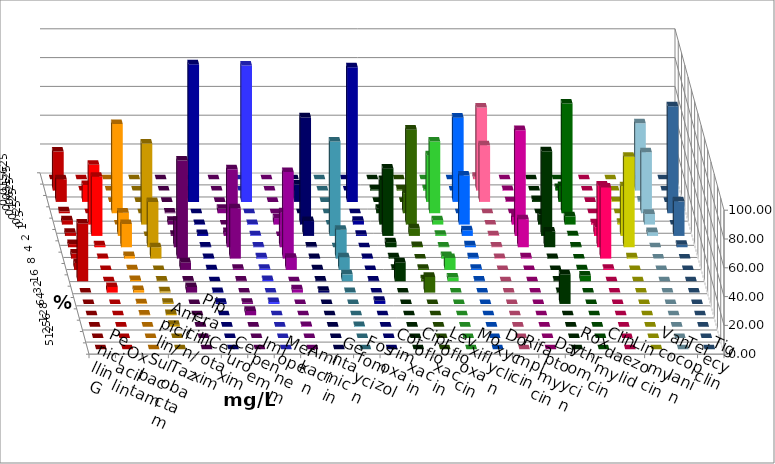
| Category | Penicillin G | Oxacillin | Ampicillin/ Sulbactam | Piperacillin/ Tazobactam | Cefotaxim | Cefuroxim | Imipenem | Meropenem | Amikacin | Gentamicin | Fosfomycin | Cotrimoxazol | Ciprofloxacin | Levofloxacin | Moxifloxacin | Doxycyclin | Rifampicin | Daptomycin | Roxythromycin | Clindamycin | Linezolid | Vancomycin | Teicoplanin | Tigecyclin |
|---|---|---|---|---|---|---|---|---|---|---|---|---|---|---|---|---|---|---|---|---|---|---|---|---|
| 0.015625 | 0 | 0 | 0 | 0 | 0 | 0 | 0 | 0 | 0 | 0 | 0 | 0 | 0 | 0 | 0 | 0 | 1.747 | 0 | 0 | 0 | 0 | 0 | 0 | 0 |
| 0.03125 | 27.074 | 0 | 0 | 0 | 0 | 0 | 0 | 0 | 0 | 0 | 0 | 0 | 0.873 | 0.873 | 0.873 | 0 | 57.642 | 0.442 | 0 | 1.762 | 0 | 0 | 0 | 46.725 |
| 0.0625 | 15.721 | 11.79 | 0 | 0 | 0 | 0 | 95.633 | 94.76 | 0 | 12.108 | 0 | 93.45 | 0 | 0 | 32.314 | 58.515 | 39.301 | 0.442 | 1.316 | 11.013 | 0 | 0.437 | 0 | 0.873 |
| 0.125 | 1.31 | 0 | 62.009 | 0 | 0.437 | 3.057 | 0 | 0 | 0 | 0 | 0 | 0 | 3.057 | 13.974 | 49.782 | 0 | 0 | 0 | 0 | 76.211 | 0 | 0 | 74.236 | 42.358 |
| 0.25 | 3.057 | 41.485 | 0 | 56.332 | 2.62 | 0 | 0.437 | 0.437 | 4.484 | 74.439 | 0 | 2.62 | 31.004 | 65.939 | 3.057 | 34.061 | 0 | 5.31 | 7.018 | 5.727 | 0.873 | 1.31 | 0 | 7.424 |
| 0.5 | 2.183 | 41.048 | 16.157 | 0 | 0.873 | 2.62 | 1.31 | 0.437 | 0 | 10.314 | 65.502 | 0.873 | 46.725 | 5.24 | 0.873 | 3.93 | 0.437 | 73.451 | 58.772 | 0.441 | 6.114 | 34.498 | 24.017 | 2.62 |
| 1.0 | 2.183 | 1.31 | 16.157 | 31.441 | 18.341 | 54.148 | 0.437 | 0.437 | 24.215 | 0.448 | 0 | 0 | 3.493 | 0.873 | 0.437 | 1.31 | 0.437 | 19.469 | 10.965 | 0.441 | 42.795 | 62.882 | 1.747 | 0 |
| 2.0 | 3.493 | 0.437 | 1.747 | 7.86 | 68.122 | 34.934 | 0.437 | 0.873 | 60.09 | 0.448 | 20.087 | 0.437 | 0.873 | 0 | 1.747 | 0.873 | 0.437 | 0.885 | 0.439 | 0 | 49.345 | 0.873 | 0 | 0 |
| 4.0 | 4.803 | 0 | 0.437 | 0 | 5.24 | 0.873 | 0.437 | 0.873 | 8.52 | 0.448 | 8.734 | 0 | 0.873 | 0.873 | 8.297 | 0.873 | 0 | 0 | 0 | 0.441 | 0.873 | 0 | 0 | 0 |
| 8.0 | 40.175 | 0 | 0.873 | 0.437 | 0.437 | 0.437 | 0 | 0.873 | 0 | 0.448 | 4.803 | 0.437 | 13.1 | 1.31 | 2.62 | 0.437 | 0 | 0 | 0.439 | 3.965 | 0 | 0 | 0 | 0 |
| 16.0 | 0 | 3.93 | 1.747 | 0.873 | 3.93 | 0 | 0.437 | 0 | 2.242 | 1.345 | 0.437 | 0 | 0 | 10.917 | 0 | 0 | 0 | 0 | 0.439 | 0 | 0 | 0 | 0 | 0 |
| 32.0 | 0 | 0 | 0.437 | 0.873 | 0 | 0.873 | 0.873 | 1.31 | 0 | 0 | 0 | 2.183 | 0 | 0 | 0 | 0 | 0 | 0 | 20.614 | 0 | 0 | 0 | 0 | 0 |
| 64.0 | 0 | 0 | 0.437 | 0.873 | 0 | 3.057 | 0 | 0 | 0 | 0 | 0 | 0 | 0 | 0 | 0 | 0 | 0 | 0 | 0 | 0 | 0 | 0 | 0 | 0 |
| 128.0 | 0 | 0 | 0 | 1.31 | 0 | 0 | 0 | 0 | 0.448 | 0 | 0.437 | 0 | 0 | 0 | 0 | 0 | 0 | 0 | 0 | 0 | 0 | 0 | 0 | 0 |
| 256.0 | 0 | 0 | 0 | 0 | 0 | 0 | 0 | 0 | 0 | 0 | 0 | 0 | 0 | 0 | 0 | 0 | 0 | 0 | 0 | 0 | 0 | 0 | 0 | 0 |
| 512.0 | 0 | 0 | 0 | 0 | 0 | 0 | 0 | 0 | 0 | 0 | 0 | 0 | 0 | 0 | 0 | 0 | 0 | 0 | 0 | 0 | 0 | 0 | 0 | 0 |